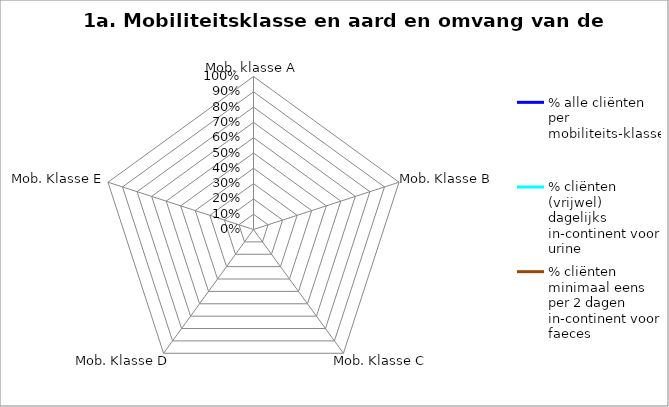
| Category | % alle cliënten per mobiliteits-klasse | % cliënten (vrijwel) dagelijks in-continent voor urine | % cliënten minimaal eens per 2 dagen in-continent voor faeces |
|---|---|---|---|
| Mob. klasse A | 0 | 0 | 0 |
| Mob. Klasse B | 0 | 0 | 0 |
| Mob. Klasse C | 0 | 0 | 0 |
| Mob. Klasse D | 0 | 0 | 0 |
| Mob. Klasse E | 0 | 0 | 0 |